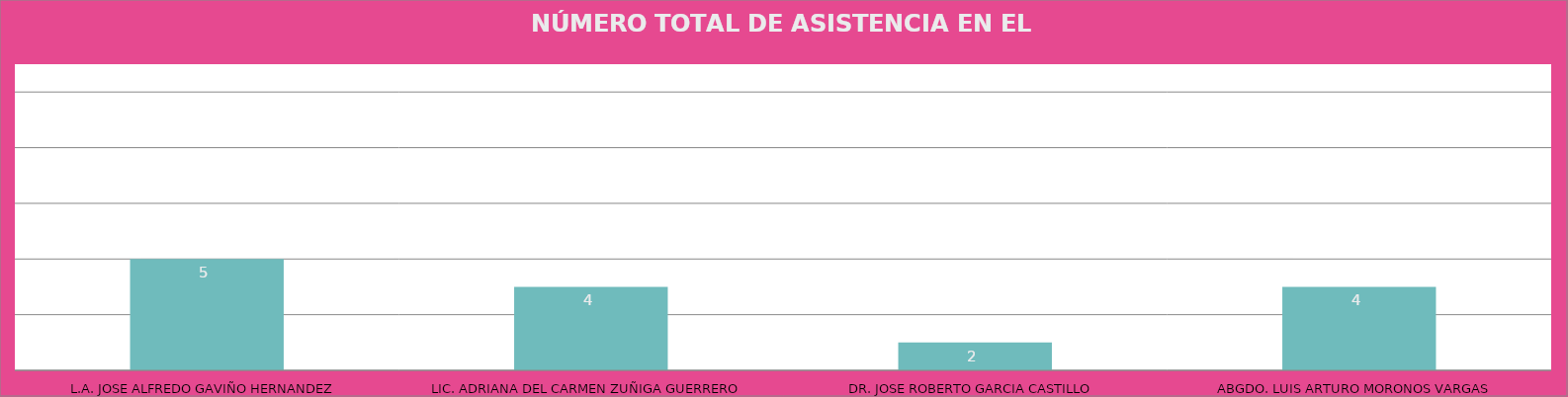
| Category | L.A. JOSE ALFREDO GAVIÑO HERNANDEZ |
|---|---|
| L.A. JOSE ALFREDO GAVIÑO HERNANDEZ | 5 |
| LIC. ADRIANA DEL CARMEN ZUÑIGA GUERRERO | 4 |
| DR. JOSE ROBERTO GARCIA CASTILLO | 2 |
| ABGDO. LUIS ARTURO MORONOS VARGAS | 4 |